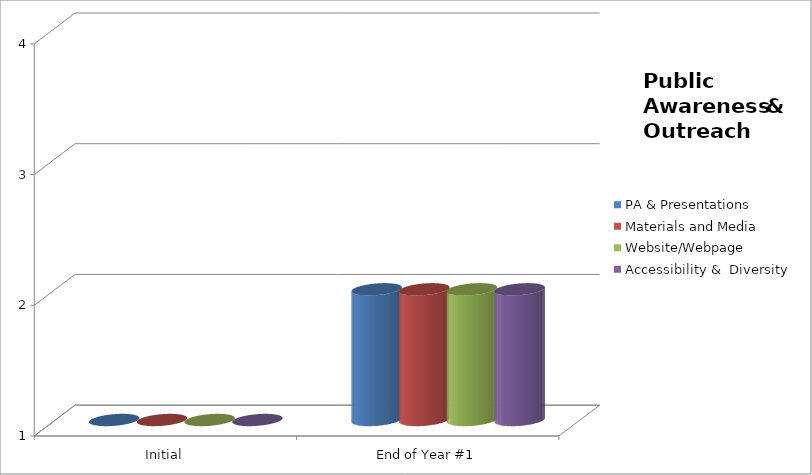
| Category | PA & Presentations 
 | Materials and Media 
 | Website/Webpage  | Accessibility &  Diversity  |
|---|---|---|---|---|
| Initial | 1 | 1 | 1 | 1 |
| End of Year #1 | 2 | 2 | 2 | 2 |